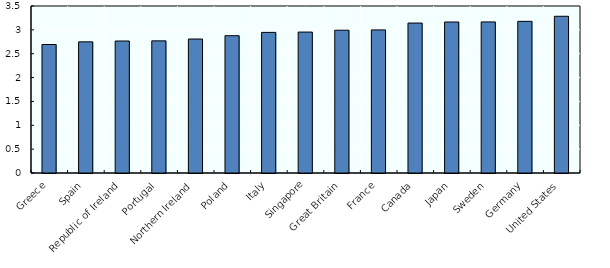
| Category | Series 0 |
|---|---|
| Greece | 2.693 |
| Spain | 2.748 |
| Republic of Ireland | 2.766 |
| Portugal | 2.769 |
| Northern Ireland | 2.808 |
| Poland | 2.878 |
| Italy | 2.947 |
| Singapore | 2.954 |
| Great Britain | 2.993 |
| France | 2.999 |
| Canada | 3.143 |
| Japan | 3.165 |
| Sweden | 3.166 |
| Germany | 3.178 |
| United States | 3.285 |